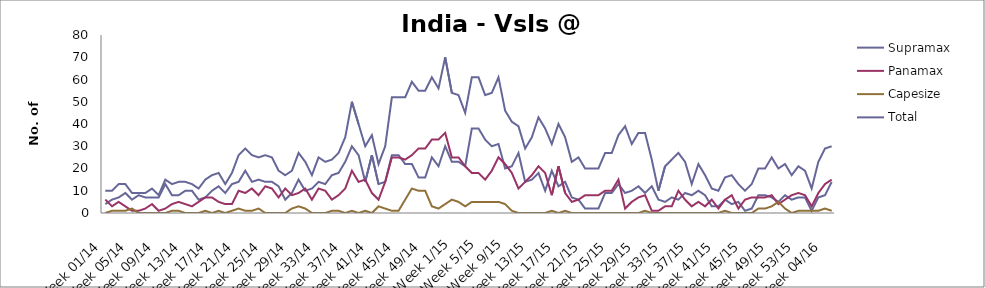
| Category | Supramax | Panamax | Capesize | Total |
|---|---|---|---|---|
| Week 01/14 | 4 | 6 | 0 | 10 |
| Week 02/14 | 6 | 3 | 1 | 10 |
| Week 03/14 | 7 | 5 | 1 | 13 |
| Week 04/14 | 9 | 3 | 1 | 13 |
| Week 05/14 | 6 | 1 | 2 | 9 |
| Week 06/14 | 8 | 1 | 0 | 9 |
| Week 07/14 | 7 | 2 | 0 | 9 |
| Week 08/14 | 7 | 4 | 0 | 11 |
| Week 09/14 | 7 | 1 | 0 | 8 |
| Week 10/14 | 13 | 2 | 0 | 15 |
| Week 11/14 | 8 | 4 | 1 | 13 |
| Week 12/14 | 8 | 5 | 1 | 14 |
| Week 13/14 | 10 | 4 | 0 | 14 |
| Week 14/14 | 10 | 3 | 0 | 13 |
| Week 15/14 | 6 | 5 | 0 | 11 |
| Week 16/14 | 7 | 7 | 1 | 15 |
| Week 17/14 | 10 | 7 | 0 | 17 |
| Week 18/14 | 12 | 5 | 1 | 18 |
| Week 19/14 | 9 | 4 | 0 | 13 |
| Week 20/14 | 13 | 4 | 1 | 18 |
| Week 21/14 | 14 | 10 | 2 | 26 |
| Week 22/14 | 19 | 9 | 1 | 29 |
| Week 23/14 | 14 | 11 | 1 | 26 |
| Week 24/14 | 15 | 8 | 2 | 25 |
| Week 25/14 | 14 | 12 | 0 | 26 |
| Week 26/14 | 14 | 11 | 0 | 25 |
| Week 27/14 | 12 | 7 | 0 | 19 |
| Week 28/14 | 6 | 11 | 0 | 17 |
| Week 29/14 | 9 | 8 | 2 | 19 |
| Week 30/14 | 15 | 9 | 3 | 27 |
| Week 31/14 | 10 | 11 | 2 | 23 |
| Week 32/14 | 11 | 6 | 0 | 17 |
| Week 33/14 | 14 | 11 | 0 | 25 |
| Week 34/14 | 13 | 10 | 0 | 23 |
| Week 35/14 | 17 | 6 | 1 | 24 |
| Week 36/14 | 18 | 8 | 1 | 27 |
| Week 37/14 | 23 | 11 | 0 | 34 |
| Week 38/14 | 30 | 19 | 1 | 50 |
| Week 39/14 | 26 | 14 | 0 | 40 |
| Week 40/14 | 14 | 15 | 1 | 30 |
| Week 41/14 | 26 | 9 | 0 | 35 |
| Week 42/14 | 13 | 6 | 3 | 22 |
| Week 43/14 | 14 | 14 | 2 | 30 |
| Week 44/14 | 26 | 25 | 1 | 52 |
| Week 45/14 | 26 | 25 | 1 | 52 |
| Week 46/14 | 22 | 24 | 6 | 52 |
| Week 47/14 | 22 | 26 | 11 | 59 |
| Week 48/14 | 16 | 29 | 10 | 55 |
| Week 49/14 | 16 | 29 | 10 | 55 |
| Week 50/14 | 25 | 33 | 3 | 61 |
| Week 51/14 | 21 | 33 | 2 | 56 |
| Week 52/14 | 30 | 36 | 4 | 70 |
| Week 1/15 | 23 | 25 | 6 | 54 |
| Week 2/15 | 23 | 25 | 5 | 53 |
| Week 3/15 | 21 | 21 | 3 | 45 |
| Week 4/15 | 38 | 18 | 5 | 61 |
| Week 5/15 | 38 | 18 | 5 | 61 |
| Week 6/15 | 33 | 15 | 5 | 53 |
| Week 7/15 | 30 | 19 | 5 | 54 |
| Week 8/15 | 31 | 25 | 5 | 61 |
| Week 9/15 | 20 | 22 | 4 | 46 |
| Week 10/15 | 21 | 18 | 1 | 41 |
| Week 11/15 | 27 | 11 | 0 | 39 |
| Week 12/15 | 14 | 14 | 0 | 29 |
| Week 13/15 | 15 | 17 | 0 | 34 |
| Week 14/15 | 18 | 21 | 0 | 43 |
| Week 15/15 | 10 | 18 | 0 | 38 |
| Week 16/15 | 19 | 8 | 1 | 31 |
| Week 17/15 | 12 | 21 | 0 | 40 |
| Week 18/15 | 14 | 9 | 1 | 34 |
| Week 19/15 | 7 | 5 | 0 | 23 |
| Week 20/15 | 6 | 6 | 0 | 25 |
| Week 21/15 | 2 | 8 | 0 | 20 |
| Week 22/15 | 2 | 8 | 0 | 20 |
| Week 23/15 | 2 | 8 | 0 | 20 |
| Week 24/15 | 9 | 10 | 0 | 27 |
| Week 25/15 | 9 | 10 | 0 | 27 |
| Week 26/15 | 13 | 15 | 0 | 35 |
| Week 27/15 | 9 | 2 | 0 | 39 |
| Week 28/15 | 10 | 5 | 0 | 31 |
| Week 29/15 | 12 | 7 | 0 | 36 |
| Week 30/15 | 9 | 8 | 1 | 36 |
| Week 31/15 | 12 | 1 | 0 | 24 |
| Week 32/15 | 6 | 1 | 0 | 10 |
| Week 33/15 | 5 | 3 | 0 | 21 |
| Week 34/15 | 7 | 3 | 0 | 24 |
| Week 35/15 | 6 | 10 | 0 | 27 |
| Week 36/15 | 9 | 6 | 0 | 23 |
| Week 37/15 | 8 | 3 | 0 | 13 |
| Week 38/15 | 10 | 5 | 0 | 22 |
| Week 39/15 | 8 | 3 | 0 | 17 |
| Week 40/15 | 3 | 6 | 0 | 11 |
| Week 41/15 | 3 | 2 | 0 | 10 |
| Week 42/15 | 6 | 6 | 1 | 16 |
| Week 43/15 | 4 | 8 | 0 | 17 |
| Week 44/15 | 5 | 2 | 0 | 13 |
| Week 45/15 | 1 | 6 | 0 | 10 |
| Week 46/15 | 2 | 7 | 0 | 13 |
| Week 47/15 | 8 | 7 | 2 | 20 |
| Week 48/15 | 8 | 7 | 2 | 20 |
| Week 49/15 | 7 | 8 | 3 | 25 |
| Week 50/15 | 5 | 4 | 5 | 20 |
| Week 51/15 | 8 | 6 | 2 | 22 |
| Week 52/15 | 6 | 8 | 0 | 17 |
| Week 53/15 | 7 | 9 | 1 | 21 |
| Week 01/16 | 7 | 8 | 1 | 19 |
| Week 02/16 | 1 | 3 | 1 | 11 |
| Week 03/16 | 7 | 9 | 1 | 23 |
| Week 04/16 | 8 | 13 | 2 | 29 |
| Week 05/16 | 14 | 15 | 1 | 30 |